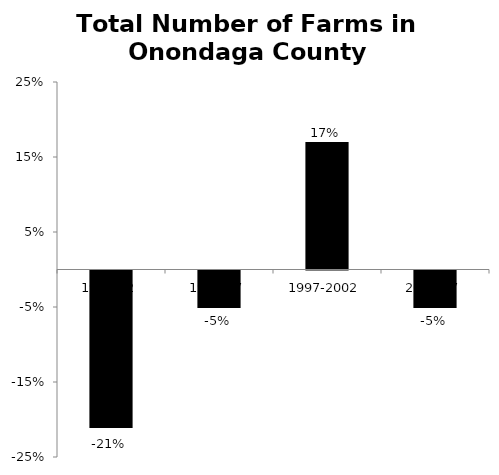
| Category | Percent Change |
|---|---|
| 1987-92 | -0.21 |
| 1992-97 | -0.05 |
| 1997-2002 | 0.17 |
| 2002-07 | -0.05 |